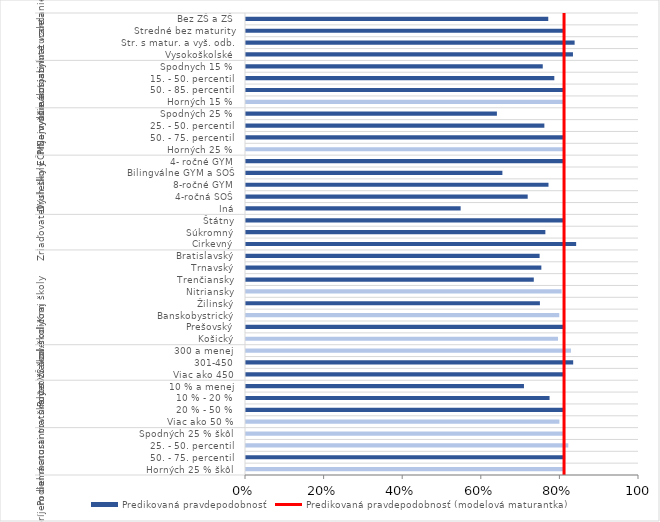
| Category | Predikovaná pravdepodobnosť |
|---|---|
| 0 | 0.811 |
| 1 | 0.812 |
| 2 | 0.82 |
| 3 | 0.806 |
| 4 | 0.797 |
| 5 | 0.812 |
| 6 | 0.772 |
| 7 | 0.707 |
| 8 | 0.812 |
| 9 | 0.833 |
| 10 | 0.827 |
| 11 | 0.794 |
| 12 | 0.812 |
| 13 | 0.797 |
| 14 | 0.748 |
| 15 | 0.803 |
| 16 | 0.732 |
| 17 | 0.752 |
| 18 | 0.747 |
| 19 | 0.84 |
| 20 | 0.762 |
| 21 | 0.812 |
| 22 | 0.546 |
| 23 | 0.717 |
| 24 | 0.77 |
| 25 | 0.652 |
| 26 | 0.812 |
| 27 | 0.812 |
| 28 | 0.812 |
| 29 | 0.759 |
| 30 | 0.638 |
| 31 | 0.809 |
| 32 | 0.812 |
| 33 | 0.785 |
| 34 | 0.755 |
| 35 | 0.832 |
| 36 | 0.836 |
| 37 | 0.812 |
| 38 | 0.769 |